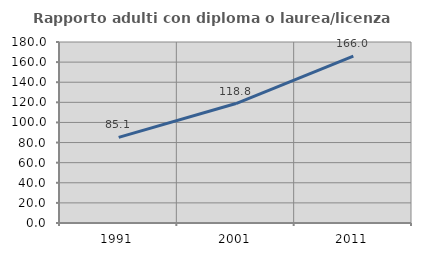
| Category | Rapporto adulti con diploma o laurea/licenza media  |
|---|---|
| 1991.0 | 85.135 |
| 2001.0 | 118.781 |
| 2011.0 | 166.034 |